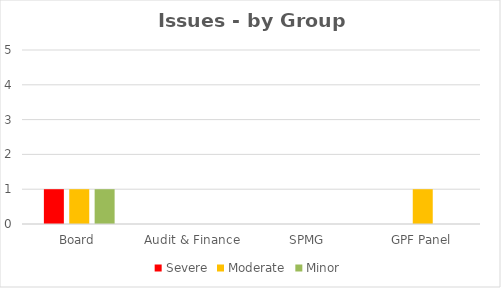
| Category | Severe | Moderate | Minor |
|---|---|---|---|
| Board | 1 | 1 | 1 |
| Audit & Finance | 0 | 0 | 0 |
| SPMG | 0 | 0 | 0 |
| GPF Panel | 0 | 1 | 0 |